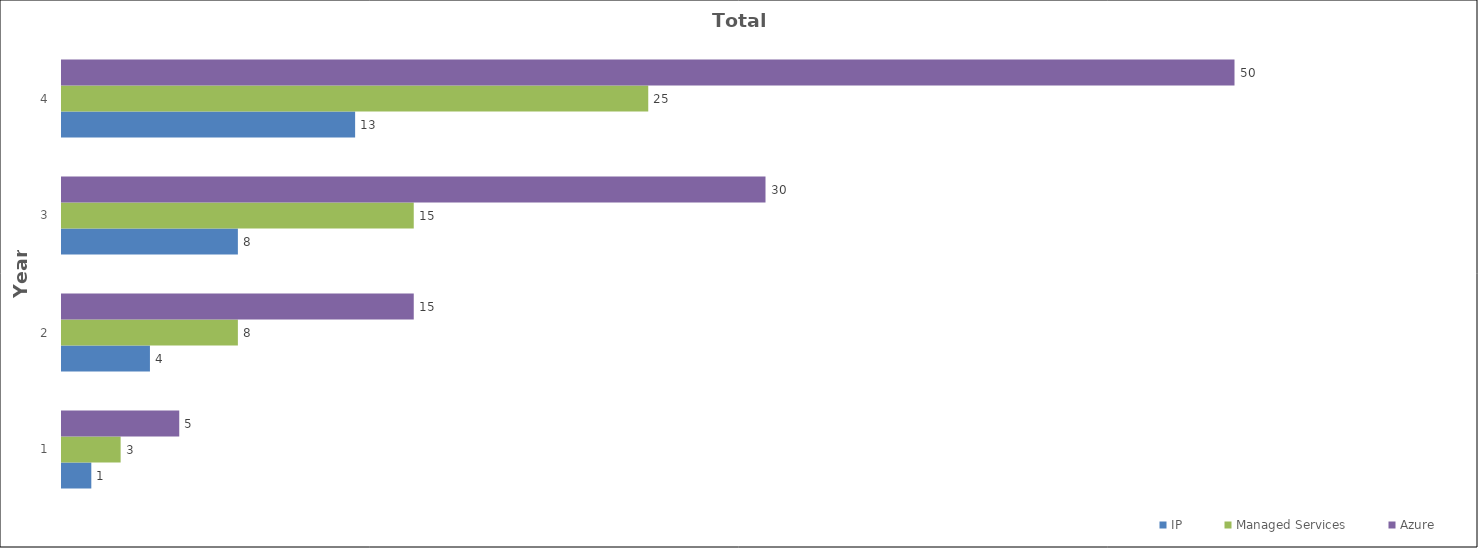
| Category | IP | Managed Services | Azure |
|---|---|---|---|
| 1.0 | 1.25 | 2.5 | 5 |
| 2.0 | 3.75 | 7.5 | 15 |
| 3.0 | 7.5 | 15 | 30 |
| 4.0 | 12.5 | 25 | 50 |